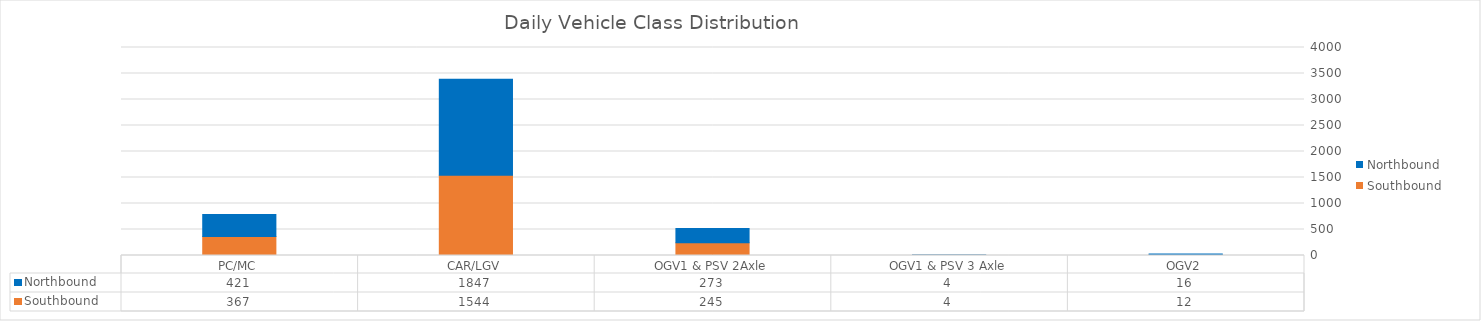
| Category | Southbound | Northbound |
|---|---|---|
| PC/MC | 367.048 | 420.619 |
| CAR/LGV | 1544.452 | 1847 |
| OGV1 & PSV 2Axle | 245.024 | 273.357 |
| OGV1 & PSV 3 Axle | 3.738 | 4 |
| OGV2 | 12.357 | 15.976 |